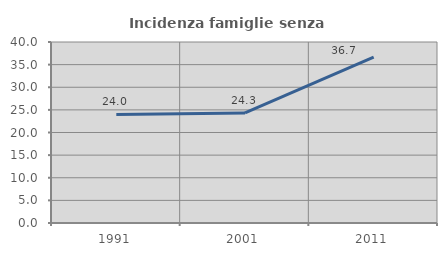
| Category | Incidenza famiglie senza nuclei |
|---|---|
| 1991.0 | 23.983 |
| 2001.0 | 24.314 |
| 2011.0 | 36.667 |